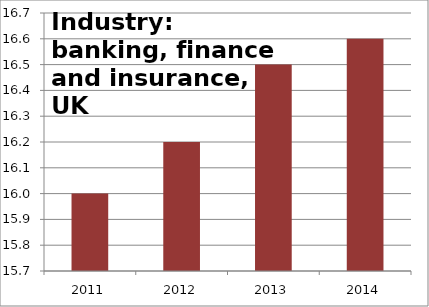
| Category | K-N: Banking, finance & insurance |
|---|---|
| 2011.0 | 16 |
| 2012.0 | 16.2 |
| 2013.0 | 16.5 |
| 2014.0 | 16.6 |